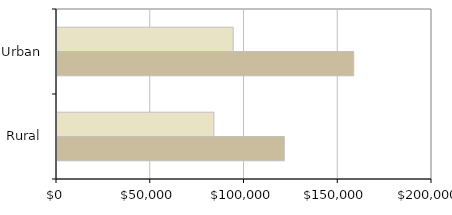
| Category | 2000 | 2010 |
|---|---|---|
| Urban | 93957 | 158269 |
| Rural | 83680 | 121231 |